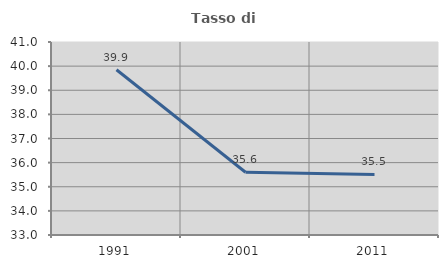
| Category | Tasso di occupazione   |
|---|---|
| 1991.0 | 39.851 |
| 2001.0 | 35.602 |
| 2011.0 | 35.513 |